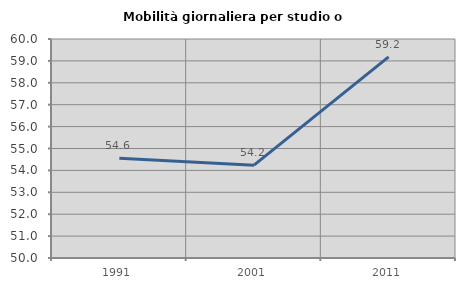
| Category | Mobilità giornaliera per studio o lavoro |
|---|---|
| 1991.0 | 54.553 |
| 2001.0 | 54.239 |
| 2011.0 | 59.186 |